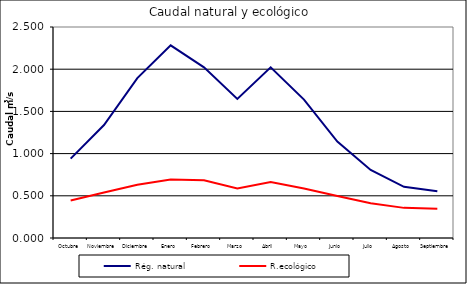
| Category | Rég. natural | R.ecológico |
|---|---|---|
| Octubre | 0.941 | 0.445 |
| Noviembre | 1.338 | 0.539 |
| Diciembre | 1.895 | 0.631 |
| Enero | 2.283 | 0.693 |
| Febrero | 2.022 | 0.683 |
| Marzo | 1.648 | 0.588 |
| Abril | 2.022 | 0.663 |
| Mayo | 1.64 | 0.587 |
| Junio | 1.143 | 0.498 |
| Julio | 0.806 | 0.411 |
| Agosto | 0.607 | 0.357 |
| Septiembre | 0.553 | 0.347 |